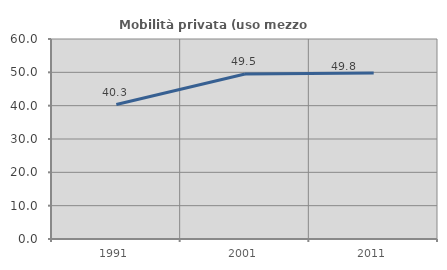
| Category | Mobilità privata (uso mezzo privato) |
|---|---|
| 1991.0 | 40.331 |
| 2001.0 | 49.498 |
| 2011.0 | 49.765 |